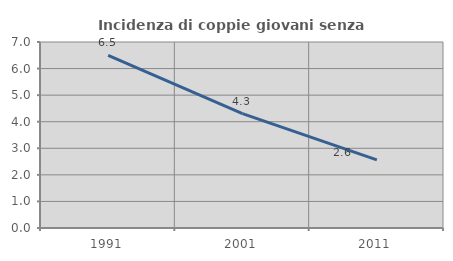
| Category | Incidenza di coppie giovani senza figli |
|---|---|
| 1991.0 | 6.497 |
| 2001.0 | 4.305 |
| 2011.0 | 2.564 |